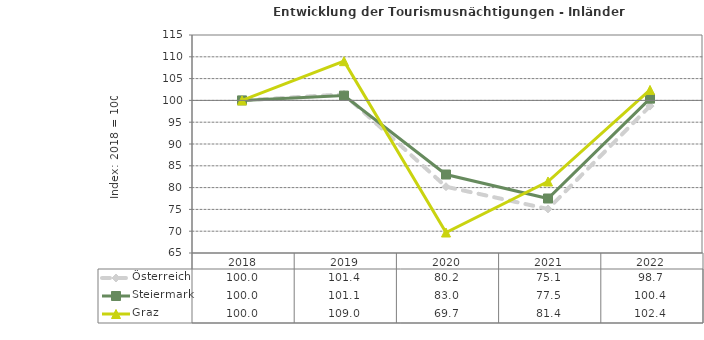
| Category | Österreich | Steiermark | Graz |
|---|---|---|---|
| 2022.0 | 98.7 | 100.4 | 102.4 |
| 2021.0 | 75.1 | 77.5 | 81.4 |
| 2020.0 | 80.2 | 83 | 69.7 |
| 2019.0 | 101.4 | 101.1 | 109 |
| 2018.0 | 100 | 100 | 100 |